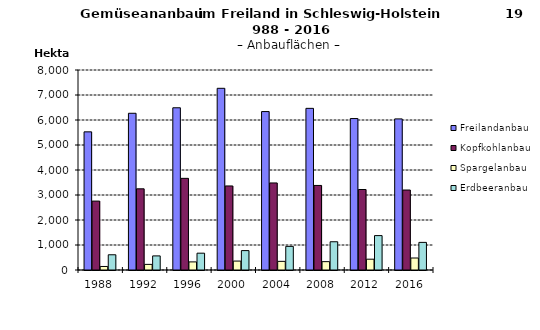
| Category | Freilandanbau | Kopfkohlanbau | Spargelanbau | Erdbeeranbau |
|---|---|---|---|---|
| 1988.0 | 5526 | 2756 | 141 | 609 |
| 1992.0 | 6269 | 3248 | 225 | 564 |
| 1996.0 | 6489 | 3666 | 324 | 673 |
| 2000.0 | 7268 | 3362 | 357 | 776 |
| 2004.0 | 6337 | 3482 | 346 | 945 |
| 2008.0 | 6466 | 3382 | 334 | 1130 |
| 2012.0 | 6058 | 3220 | 432 | 1376 |
| 2016.0 | 6044 | 3199 | 480 | 1105 |